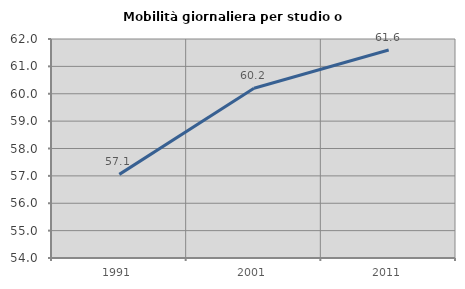
| Category | Mobilità giornaliera per studio o lavoro |
|---|---|
| 1991.0 | 57.055 |
| 2001.0 | 60.202 |
| 2011.0 | 61.598 |